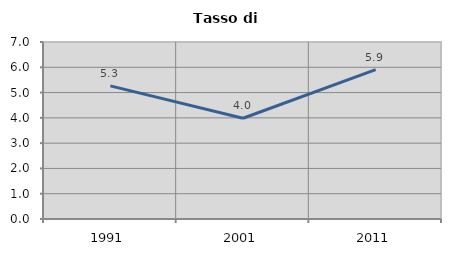
| Category | Tasso di disoccupazione   |
|---|---|
| 1991.0 | 5.263 |
| 2001.0 | 3.986 |
| 2011.0 | 5.907 |